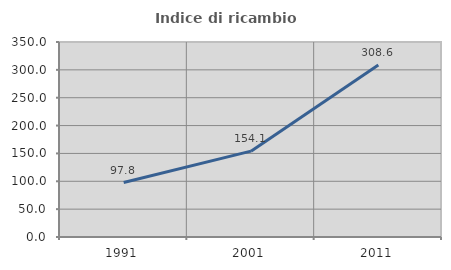
| Category | Indice di ricambio occupazionale  |
|---|---|
| 1991.0 | 97.81 |
| 2001.0 | 154.118 |
| 2011.0 | 308.571 |